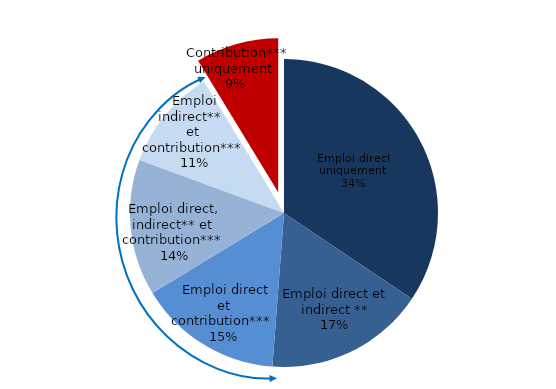
| Category | Series 0 |
|---|---|
| 0 | 34.4 |
| 1 | 16.8 |
| 2 | 15.1 |
| 3 | 14.3 |
| 4 | 10.7 |
| 5 | 8.7 |